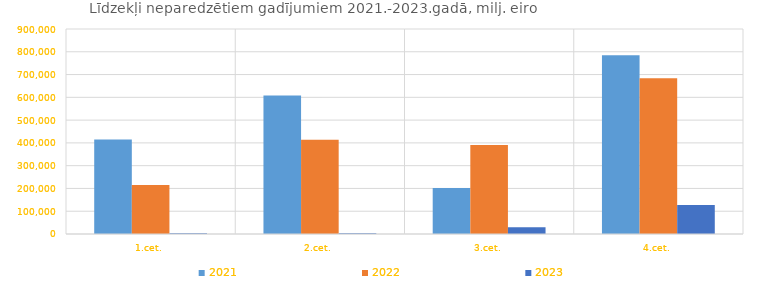
| Category | 2021 | 2022 | 2023 |
|---|---|---|---|
| 1.cet. | 415308660 | 215046075 | 3156761 |
| 2.cet. | 607771249 | 413662594 | 2825854 |
| 3.cet. | 201460904 | 390313993 | 29897728 |
| 4.cet. | 784800189 | 683451678 | 126899563 |